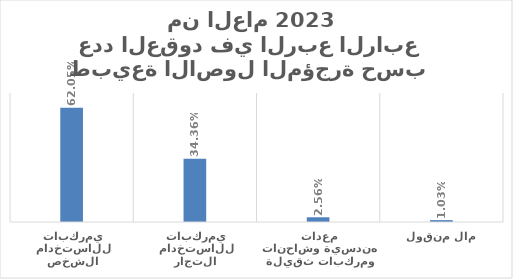
| Category | Series 0 |
|---|---|
| مركبات للاستخدام الشخصي  | 0.621 |
| مركبات للاستخدام التجاري  | 0.344 |
| معدات هندسية وشاحنات ومركبات ثقيلة | 0.026 |
| مال منقول | 0.01 |